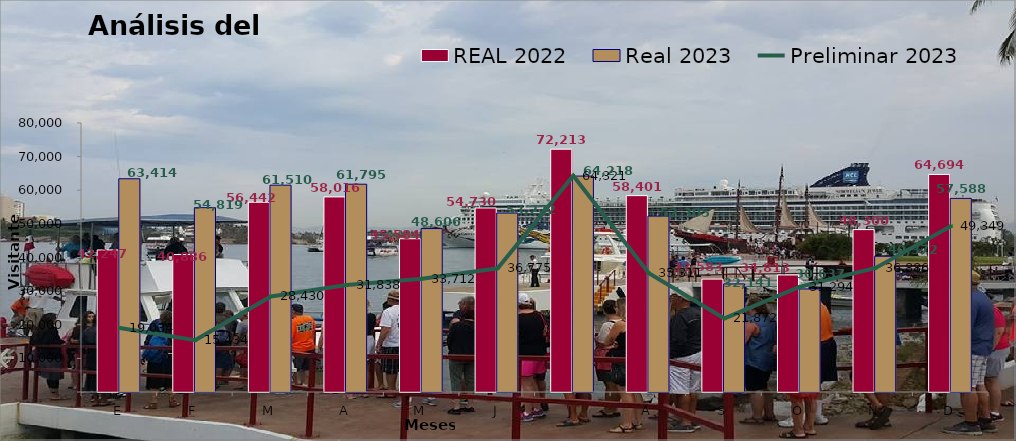
| Category | REAL 2022 | Real 2023 |
|---|---|---|
| E | 42247 | 63414 |
| F | 40886 | 54819 |
| M | 56442 | 61510 |
| A | 58016 | 61795 |
| M | 45584 | 48606 |
| J | 54730 | 53222 |
| J | 72213 | 64218 |
| A | 58401 | 52305 |
| S | 33583 | 32141 |
| O | 34813 | 30637 |
| N | 48300 | 40372 |
| D | 64694 | 57588 |